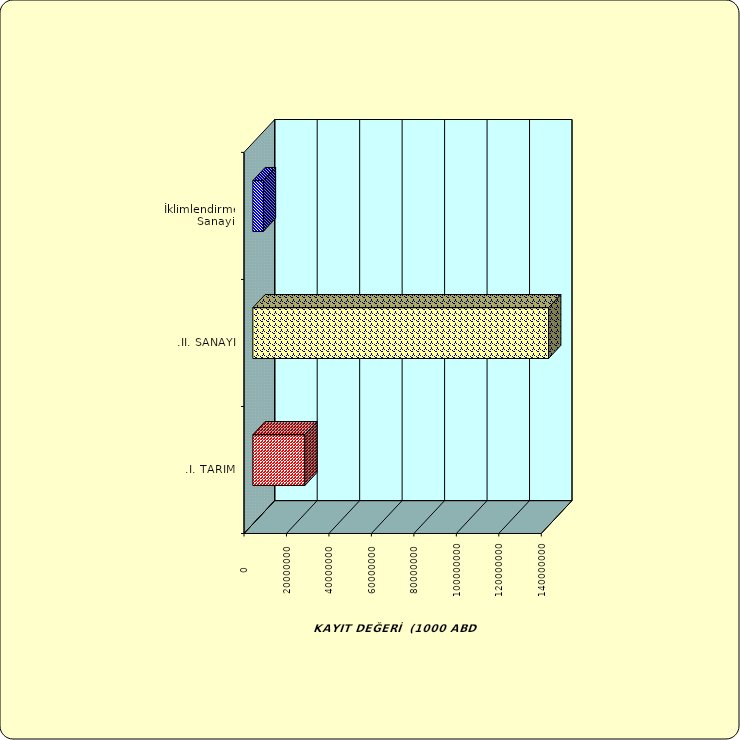
| Category | Series 0 |
|---|---|
| .I. TARIM | 24496728.308 |
| .II. SANAYİ | 139282696.258 |
|  İklimlendirme Sanayii | 4946082.379 |